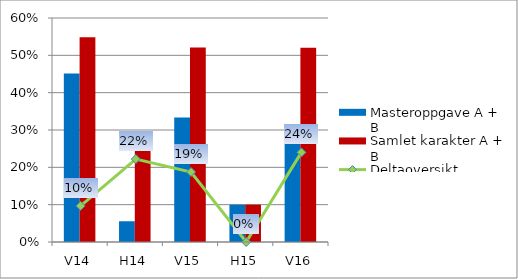
| Category | Masteroppgave A + B | Samlet karakter A + B |
|---|---|---|
| V14 | 0.452 | 0.548 |
| H14 | 0.056 | 0.278 |
| V15 | 0.333 | 0.521 |
| H15 | 0.1 | 0.1 |
| V16 | 0.28 | 0.52 |